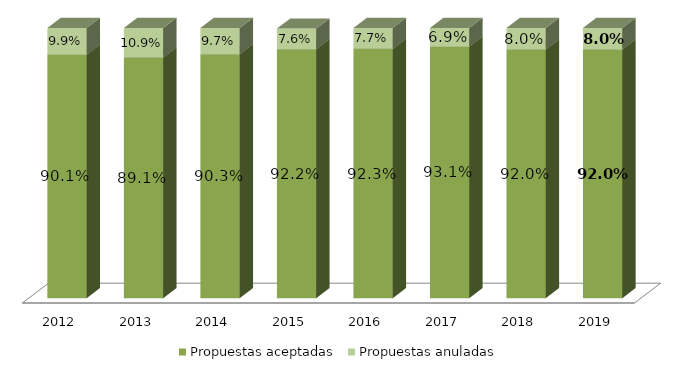
| Category | Propuestas aceptadas | Propuestas anuladas |
|---|---|---|
| 2012.0 | 0.901 | 0.099 |
| 2013.0 | 0.891 | 0.109 |
| 2014.0 | 0.903 | 0.097 |
| 2015.0 | 0.922 | 0.076 |
| 2016.0 | 0.923 | 0.077 |
| 2017.0 | 0.931 | 0.069 |
| 2018.0 | 0.92 | 0.08 |
| 2019.0 | 0.92 | 0.08 |